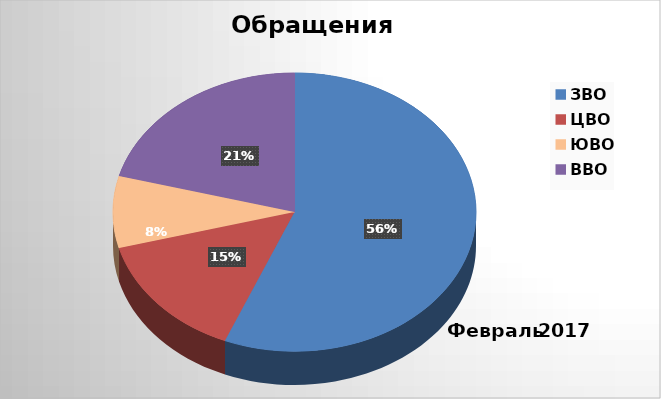
| Category | Series 0 |
|---|---|
| ЗВО | 27 |
| ЦВО | 7 |
| ЮВО | 4 |
| ВВО | 10 |